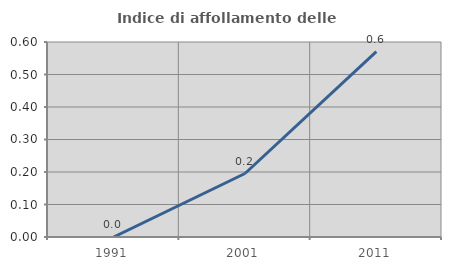
| Category | Indice di affollamento delle abitazioni  |
|---|---|
| 1991.0 | 0 |
| 2001.0 | 0.195 |
| 2011.0 | 0.57 |